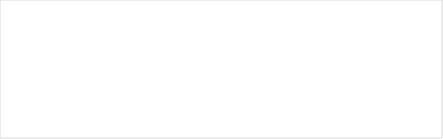
| Category | Series 0 |
|---|---|
| bioplin | 0 |
| metan | 0 |